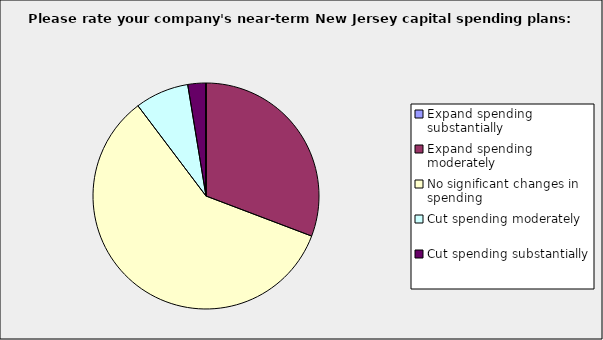
| Category | Series 0 |
|---|---|
| Expand spending substantially | 0 |
| Expand spending moderately | 0.308 |
| No significant changes in spending | 0.59 |
| Cut spending moderately | 0.077 |
| Cut spending substantially | 0.026 |